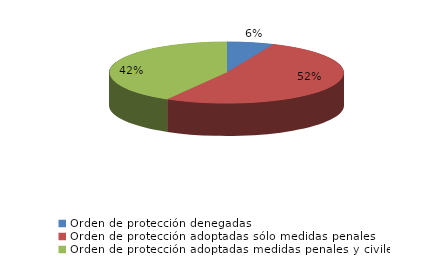
| Category | Series 0 |
|---|---|
| Orden de protección denegadas | 51 |
| Orden de protección adoptadas sólo medidas penales | 410 |
| Orden de protección adoptadas medidas penales y civiles | 329 |